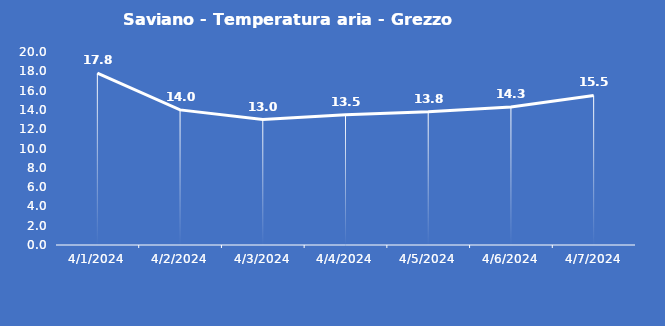
| Category | Saviano - Temperatura aria - Grezzo (°C) |
|---|---|
| 4/1/24 | 17.8 |
| 4/2/24 | 14 |
| 4/3/24 | 13 |
| 4/4/24 | 13.5 |
| 4/5/24 | 13.8 |
| 4/6/24 | 14.3 |
| 4/7/24 | 15.5 |